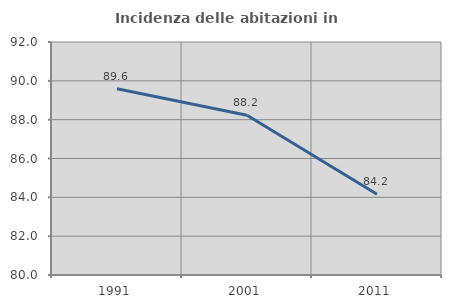
| Category | Incidenza delle abitazioni in proprietà  |
|---|---|
| 1991.0 | 89.589 |
| 2001.0 | 88.228 |
| 2011.0 | 84.156 |